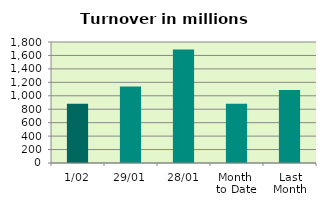
| Category | Series 0 |
|---|---|
| 1/02 | 882.231 |
| 29/01 | 1138.59 |
| 28/01 | 1687.12 |
| Month 
to Date | 882.231 |
| Last
Month | 1085.964 |